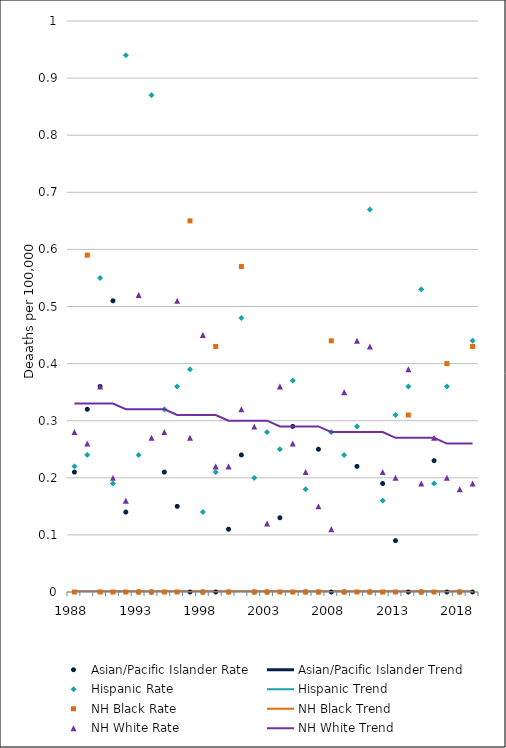
| Category | Asian/Pacific Islander Rate | Asian/Pacific Islander Trend | Hispanic Rate | Hispanic Trend | NH Black Rate | NH Black Trend | NH White Rate | NH White Trend |
|---|---|---|---|---|---|---|---|---|
| 1988.0 | 0.21 | 0 | 0.22 | 0 | 0 | 0 | 0.28 | 0.33 |
| 1989.0 | 0.32 | 0 | 0.24 | 0 | 0.59 | 0 | 0.26 | 0.33 |
| 1990.0 | 0.36 | 0 | 0.55 | 0 | 0 | 0 | 0.36 | 0.33 |
| 1991.0 | 0.51 | 0 | 0.19 | 0 | 0 | 0 | 0.2 | 0.33 |
| 1992.0 | 0.14 | 0 | 0.94 | 0 | 0 | 0 | 0.16 | 0.32 |
| 1993.0 | 0 | 0 | 0.24 | 0 | 0 | 0 | 0.52 | 0.32 |
| 1994.0 | 0 | 0 | 0.87 | 0 | 0 | 0 | 0.27 | 0.32 |
| 1995.0 | 0.21 | 0 | 0.32 | 0 | 0 | 0 | 0.28 | 0.32 |
| 1996.0 | 0.15 | 0 | 0.36 | 0 | 0 | 0 | 0.51 | 0.31 |
| 1997.0 | 0 | 0 | 0.39 | 0 | 0.65 | 0 | 0.27 | 0.31 |
| 1998.0 | 0 | 0 | 0.14 | 0 | 0 | 0 | 0.45 | 0.31 |
| 1999.0 | 0 | 0 | 0.21 | 0 | 0.43 | 0 | 0.22 | 0.31 |
| 2000.0 | 0.11 | 0 | 0 | 0 | 0 | 0 | 0.22 | 0.3 |
| 2001.0 | 0.24 | 0 | 0.48 | 0 | 0.57 | 0 | 0.32 | 0.3 |
| 2002.0 | 0 | 0 | 0.2 | 0 | 0 | 0 | 0.29 | 0.3 |
| 2003.0 | 0 | 0 | 0.28 | 0 | 0 | 0 | 0.12 | 0.3 |
| 2004.0 | 0.13 | 0 | 0.25 | 0 | 0 | 0 | 0.36 | 0.29 |
| 2005.0 | 0.29 | 0 | 0.37 | 0 | 0 | 0 | 0.26 | 0.29 |
| 2006.0 | 0 | 0 | 0.18 | 0 | 0 | 0 | 0.21 | 0.29 |
| 2007.0 | 0.25 | 0 | 0 | 0 | 0 | 0 | 0.15 | 0.29 |
| 2008.0 | 0 | 0 | 0.28 | 0 | 0.44 | 0 | 0.11 | 0.28 |
| 2009.0 | 0 | 0 | 0.24 | 0 | 0 | 0 | 0.35 | 0.28 |
| 2010.0 | 0.22 | 0 | 0.29 | 0 | 0 | 0 | 0.44 | 0.28 |
| 2011.0 | 0 | 0 | 0.67 | 0 | 0 | 0 | 0.43 | 0.28 |
| 2012.0 | 0.19 | 0 | 0.16 | 0 | 0 | 0 | 0.21 | 0.28 |
| 2013.0 | 0.09 | 0 | 0.31 | 0 | 0 | 0 | 0.2 | 0.27 |
| 2014.0 | 0 | 0 | 0.36 | 0 | 0.31 | 0 | 0.39 | 0.27 |
| 2015.0 | 0 | 0 | 0.53 | 0 | 0 | 0 | 0.19 | 0.27 |
| 2016.0 | 0.23 | 0 | 0.19 | 0 | 0 | 0 | 0.27 | 0.27 |
| 2017.0 | 0 | 0 | 0.36 | 0 | 0.4 | 0 | 0.2 | 0.26 |
| 2018.0 | 0 | 0 | 0 | 0 | 0 | 0 | 0.18 | 0.26 |
| 2019.0 | 0 | 0 | 0.44 | 0 | 0.43 | 0 | 0.19 | 0.26 |